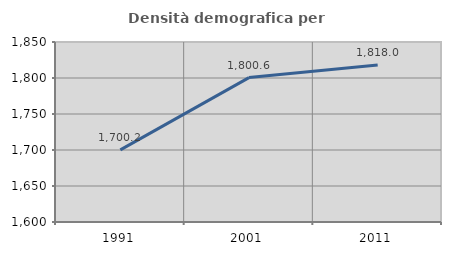
| Category | Densità demografica |
|---|---|
| 1991.0 | 1700.188 |
| 2001.0 | 1800.571 |
| 2011.0 | 1818.009 |